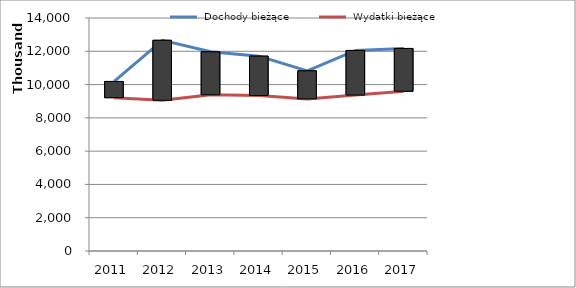
| Category |  Dochody bieżące |  Wydatki bieżące |
|---|---|---|
| 2011.0 | 10187163.27 | 9211865.66 |
| 2012.0 | 12660364.54 | 9055670.43 |
| 2013.0 | 11968299.93 | 9384342.04 |
| 2014.0 | 11708269.67 | 9344048.48 |
| 2015.0 | 10825000 | 9140000 |
| 2016.0 | 12050000 | 9368000 |
| 2017.0 | 12170000 | 9600000 |